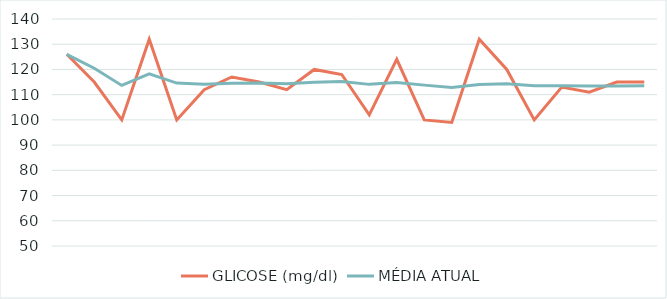
| Category | GLICOSE (mg/dl) | MÉDIA ATUAL |
|---|---|---|
| 0 | 126 | 126 |
| 1 | 115 | 120.5 |
| 2 | 100 | 113.667 |
| 3 | 132 | 118.25 |
| 4 | 100 | 114.6 |
| 5 | 112 | 114.167 |
| 6 | 117 | 114.571 |
| 7 | 115 | 114.625 |
| 8 | 112 | 114.333 |
| 9 | 120 | 114.9 |
| 10 | 118 | 115.182 |
| 11 | 102 | 114.083 |
| 12 | 124 | 114.846 |
| 13 | 100 | 113.786 |
| 14 | 99 | 112.8 |
| 15 | 132 | 114 |
| 16 | 120 | 114.353 |
| 17 | 100 | 113.556 |
| 18 | 113 | 113.526 |
| 19 | 111 | 113.4 |
| 20 | 115 | 113.476 |
| 21 | 115 | 113.545 |